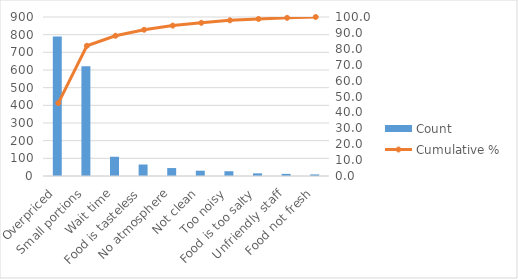
| Category | Count |
|---|---|
| Overpriced | 789 |
| Small portions | 621 |
| Wait time | 109 |
| Food is tasteless | 65 |
| No atmosphere | 45 |
| Not clean | 30 |
| Too noisy | 27 |
| Food is too salty | 15 |
| Unfriendly staff | 12 |
| Food not fresh | 9 |